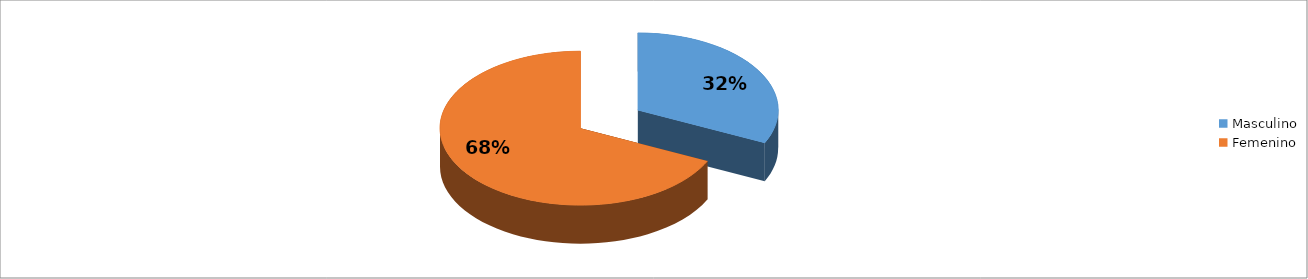
| Category | Series 0 |
|---|---|
| Masculino | 0.32 |
| Femenino | 0.68 |